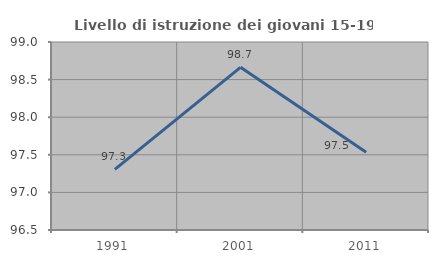
| Category | Livello di istruzione dei giovani 15-19 anni |
|---|---|
| 1991.0 | 97.305 |
| 2001.0 | 98.664 |
| 2011.0 | 97.534 |